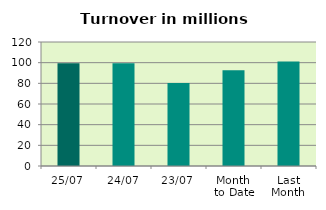
| Category | Series 0 |
|---|---|
| 25/07 | 99.511 |
| 24/07 | 99.48 |
| 23/07 | 80.367 |
| Month 
to Date | 92.64 |
| Last
Month | 101.166 |